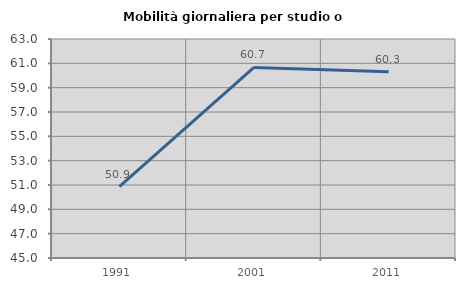
| Category | Mobilità giornaliera per studio o lavoro |
|---|---|
| 1991.0 | 50.865 |
| 2001.0 | 60.665 |
| 2011.0 | 60.305 |